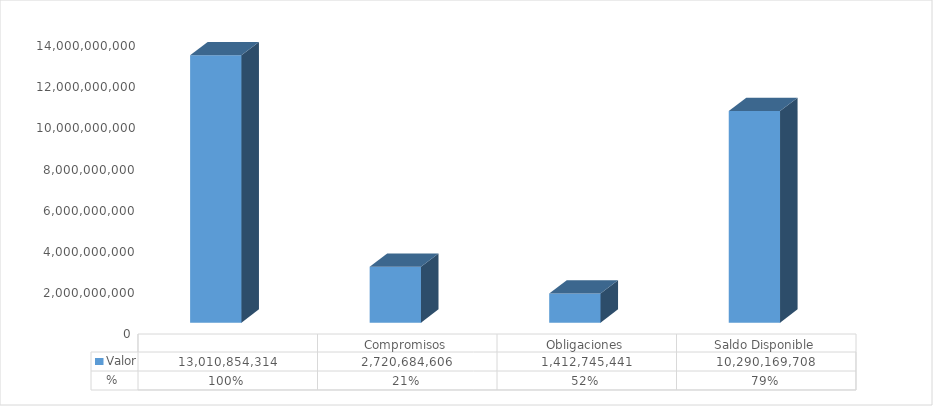
| Category | Valor | % |
|---|---|---|
|  | 13010854314.19 | 1 |
| Compromisos | 2720684605.78 | 0.209 |
| Obligaciones | 1412745440.78 | 0.519 |
| Saldo Disponible | 10290169708.41 | 0.791 |